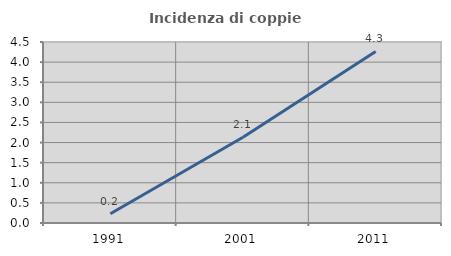
| Category | Incidenza di coppie miste |
|---|---|
| 1991.0 | 0.229 |
| 2001.0 | 2.132 |
| 2011.0 | 4.266 |